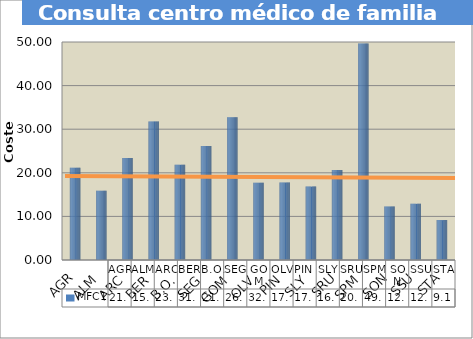
| Category | MFC1 |
|---|---|
| AGR | 21.16 |
| ALM | 15.878 |
| ARC | 23.375 |
| BER | 31.787 |
| B.O. | 21.844 |
| SEG | 26.15 |
| GOM | 32.746 |
| OLV | 17.693 |
| PIN | 17.77 |
| SLY | 16.835 |
| SRU | 20.614 |
| SPM | 49.63 |
| SON | 12.26 |
| SSU | 12.88 |
| STA | 9.147 |